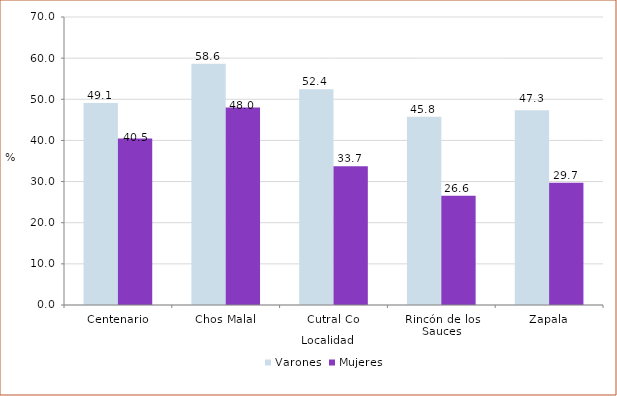
| Category | Varones | Mujeres |
|---|---|---|
| Centenario | 49.067 | 40.45 |
| Chos Malal | 58.626 | 48.016 |
| Cutral Co | 52.421 | 33.745 |
| Rincón de los Sauces | 45.757 | 26.571 |
| Zapala | 47.311 | 29.697 |